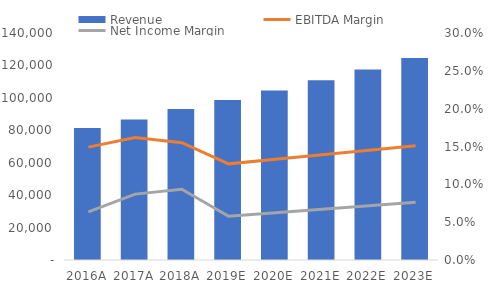
| Category | Revenue |
|---|---|
| 2016.0 | 81422 |
| 2017.0 | 86698 |
| 2018.0 | 93085.92 |
| 2019.0 | 98671.075 |
| 2020.0 | 104591.34 |
| 2021.0 | 110866.82 |
| 2022.0 | 117518.829 |
| 2023.0 | 124569.959 |